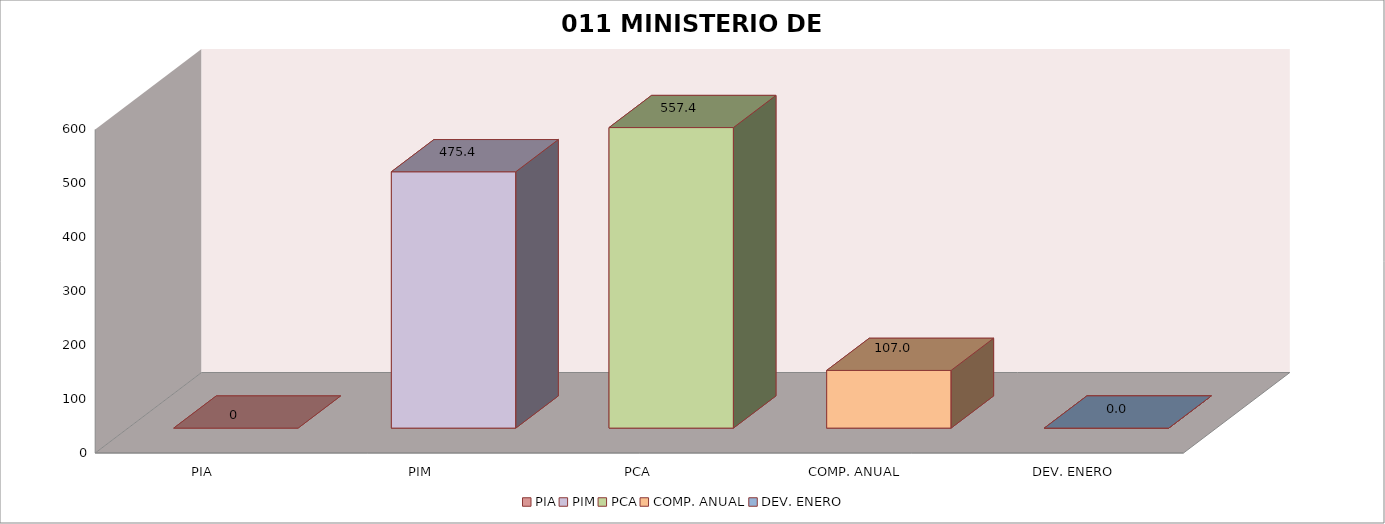
| Category | 011 MINISTERIO DE SALUD |
|---|---|
| PIA | 0 |
| PIM | 475.409 |
| PCA | 557.377 |
| COMP. ANUAL | 106.962 |
| DEV. ENERO | 0.044 |